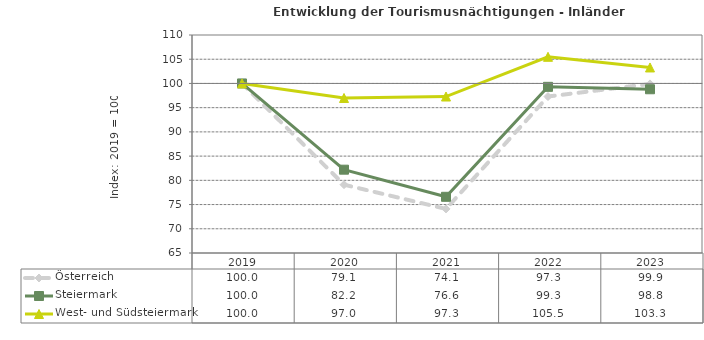
| Category | Österreich | Steiermark | West- und Südsteiermark |
|---|---|---|---|
| 2023.0 | 99.9 | 98.8 | 103.3 |
| 2022.0 | 97.3 | 99.3 | 105.5 |
| 2021.0 | 74.1 | 76.6 | 97.3 |
| 2020.0 | 79.1 | 82.2 | 97 |
| 2019.0 | 100 | 100 | 100 |